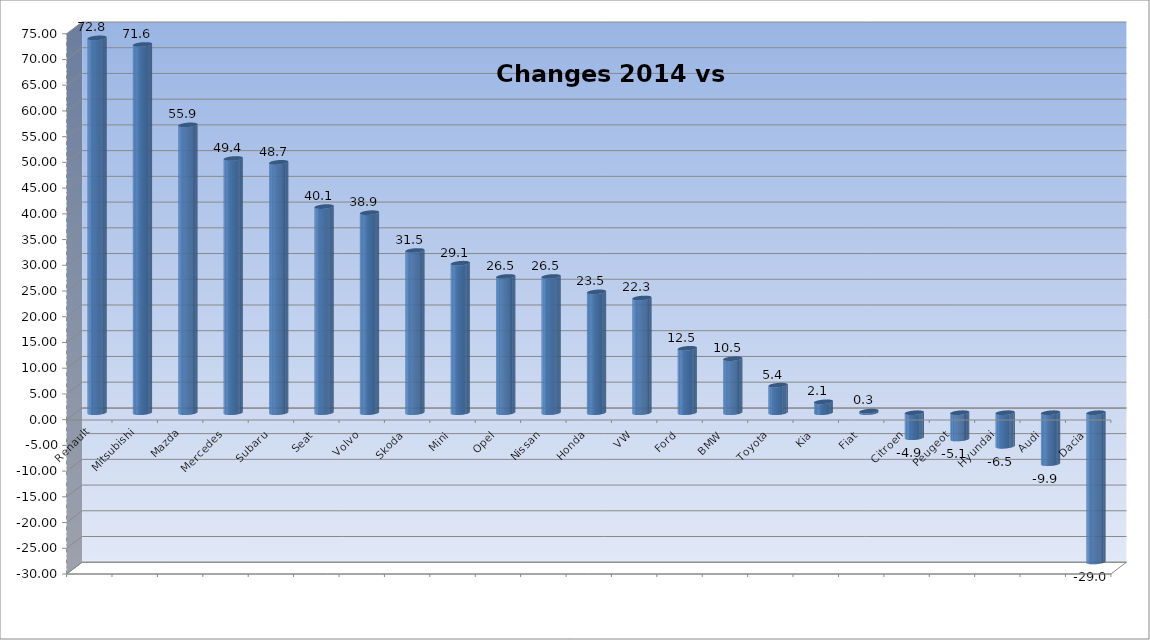
| Category | Ytd 2015 |
|---|---|
| Renault | 72.848 |
| Mitsubishi | 71.569 |
| Mazda | 55.941 |
| Mercedes | 49.413 |
| Subaru | 48.665 |
| Seat | 40.059 |
| Volvo | 38.877 |
| Skoda | 31.53 |
| Mini | 29.054 |
| Opel | 26.478 |
| Nissan | 26.476 |
| Honda | 23.488 |
| VW | 22.297 |
| Ford | 12.517 |
| BMW | 10.5 |
| Toyota | 5.355 |
| Kia | 2.117 |
| Fiat | 0.309 |
| Citroen | -4.864 |
| Peugeot | -5.111 |
| Hyundai | -6.531 |
| Audi | -9.914 |
| Dacia | -29.011 |